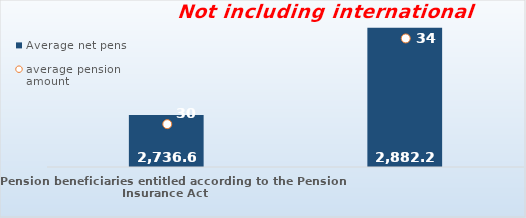
| Category | Average net pension  |
|---|---|
| Pension beneficiaries entitled according to the Pension Insurance Act   | 2736.62 |
| Pension beneficiaries entitled to pension FOR THE FIRST TIME in 2019 according to the Pension Insurance Act  - NEW BENEFICIARIES | 2882.233 |